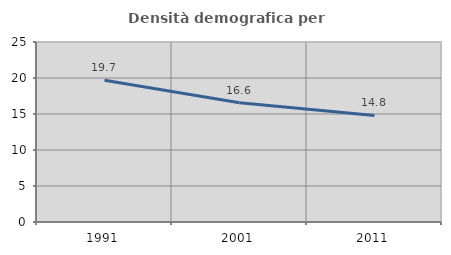
| Category | Densità demografica |
|---|---|
| 1991.0 | 19.687 |
| 2001.0 | 16.568 |
| 2011.0 | 14.799 |